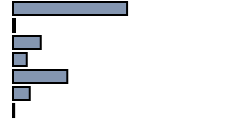
| Category | Series 0 |
|---|---|
| 0 | 49.6 |
| 1 | 0.9 |
| 2 | 12.1 |
| 3 | 6 |
| 4 | 23.6 |
| 5 | 7.3 |
| 6 | 0.5 |